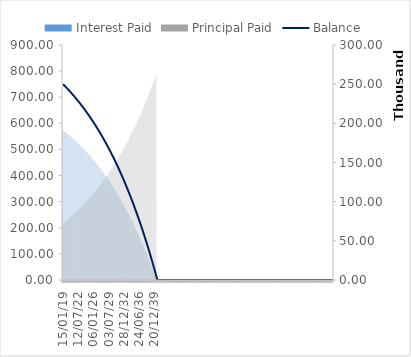
| Category | Interest Paid | Principal Paid |
|---|---|---|
| 15/01/19 | 576.148 | 214.712 |
| 29/01/19 | 575.654 | 215.207 |
| 12/02/19 | 575.158 | 215.703 |
| 26/02/19 | 574.661 | 216.2 |
| 12/03/19 | 574.162 | 216.698 |
| 26/03/19 | 573.663 | 217.197 |
| 09/04/19 | 573.162 | 217.698 |
| 23/04/19 | 572.661 | 218.2 |
| 07/05/19 | 572.158 | 218.702 |
| 21/05/19 | 571.654 | 219.206 |
| 04/06/19 | 571.149 | 219.712 |
| 18/06/19 | 570.642 | 220.218 |
| 02/07/19 | 570.135 | 220.725 |
| 16/07/19 | 569.626 | 221.234 |
| 30/07/19 | 569.116 | 221.744 |
| 13/08/19 | 568.605 | 222.255 |
| 27/08/19 | 568.093 | 222.767 |
| 10/09/19 | 567.58 | 223.281 |
| 24/09/19 | 567.065 | 223.795 |
| 08/10/19 | 566.549 | 224.311 |
| 22/10/19 | 566.032 | 224.828 |
| 05/11/19 | 565.514 | 225.346 |
| 19/11/19 | 564.995 | 225.865 |
| 03/12/19 | 564.474 | 226.386 |
| 17/12/19 | 563.953 | 226.908 |
| 31/12/19 | 563.43 | 227.431 |
| 14/01/20 | 562.905 | 227.955 |
| 28/01/20 | 562.38 | 228.48 |
| 11/02/20 | 561.854 | 229.007 |
| 25/02/20 | 561.326 | 229.534 |
| 10/03/20 | 560.797 | 230.063 |
| 24/03/20 | 560.267 | 230.594 |
| 07/04/20 | 559.735 | 231.125 |
| 21/04/20 | 559.203 | 231.658 |
| 05/05/20 | 558.669 | 232.192 |
| 19/05/20 | 558.134 | 232.727 |
| 02/06/20 | 557.597 | 233.263 |
| 16/06/20 | 557.06 | 233.801 |
| 30/06/20 | 556.521 | 234.339 |
| 14/07/20 | 555.981 | 234.879 |
| 28/07/20 | 555.439 | 235.421 |
| 11/08/20 | 554.897 | 235.963 |
| 25/08/20 | 554.353 | 236.507 |
| 08/09/20 | 553.808 | 237.052 |
| 22/09/20 | 553.262 | 237.598 |
| 06/10/20 | 552.714 | 238.146 |
| 20/10/20 | 552.165 | 238.695 |
| 03/11/20 | 551.615 | 239.245 |
| 17/11/20 | 551.064 | 239.796 |
| 01/12/20 | 550.511 | 240.349 |
| 15/12/20 | 549.957 | 240.903 |
| 29/12/20 | 549.402 | 241.458 |
| 12/01/21 | 548.846 | 242.014 |
| 26/01/21 | 548.288 | 242.572 |
| 09/02/21 | 547.729 | 243.131 |
| 23/02/21 | 547.169 | 243.692 |
| 09/03/21 | 546.607 | 244.253 |
| 23/03/21 | 546.044 | 244.816 |
| 06/04/21 | 545.48 | 245.38 |
| 20/04/21 | 544.914 | 245.946 |
| 04/05/21 | 544.348 | 246.513 |
| 18/05/21 | 543.78 | 247.081 |
| 01/06/21 | 543.21 | 247.65 |
| 15/06/21 | 542.639 | 248.221 |
| 29/06/21 | 542.067 | 248.793 |
| 13/07/21 | 541.494 | 249.366 |
| 27/07/21 | 540.919 | 249.941 |
| 10/08/21 | 540.343 | 250.517 |
| 24/08/21 | 539.766 | 251.094 |
| 07/09/21 | 539.187 | 251.673 |
| 21/09/21 | 538.607 | 252.253 |
| 05/10/21 | 538.026 | 252.834 |
| 19/10/21 | 537.443 | 253.417 |
| 02/11/21 | 536.859 | 254.001 |
| 16/11/21 | 536.274 | 254.586 |
| 30/11/21 | 535.687 | 255.173 |
| 14/12/21 | 535.099 | 255.761 |
| 28/12/21 | 534.51 | 256.351 |
| 11/01/22 | 533.919 | 256.941 |
| 25/01/22 | 533.327 | 257.534 |
| 08/02/22 | 532.733 | 258.127 |
| 22/02/22 | 532.138 | 258.722 |
| 08/03/22 | 531.542 | 259.318 |
| 22/03/22 | 530.944 | 259.916 |
| 05/04/22 | 530.345 | 260.515 |
| 19/04/22 | 529.745 | 261.115 |
| 03/05/22 | 529.143 | 261.717 |
| 17/05/22 | 528.54 | 262.32 |
| 31/05/22 | 527.936 | 262.925 |
| 14/06/22 | 527.33 | 263.531 |
| 28/06/22 | 526.722 | 264.138 |
| 12/07/22 | 526.114 | 264.747 |
| 26/07/22 | 525.503 | 265.357 |
| 09/08/22 | 524.892 | 265.968 |
| 23/08/22 | 524.279 | 266.581 |
| 06/09/22 | 523.665 | 267.196 |
| 20/09/22 | 523.049 | 267.811 |
| 04/10/22 | 522.432 | 268.429 |
| 18/10/22 | 521.813 | 269.047 |
| 01/11/22 | 521.193 | 269.667 |
| 15/11/22 | 520.571 | 270.289 |
| 29/11/22 | 519.949 | 270.912 |
| 13/12/22 | 519.324 | 271.536 |
| 27/12/22 | 518.698 | 272.162 |
| 10/01/23 | 518.071 | 272.789 |
| 24/01/23 | 517.443 | 273.418 |
| 07/02/23 | 516.812 | 274.048 |
| 21/02/23 | 516.181 | 274.679 |
| 07/03/23 | 515.548 | 275.312 |
| 21/03/23 | 514.913 | 275.947 |
| 04/04/23 | 514.277 | 276.583 |
| 18/04/23 | 513.64 | 277.22 |
| 02/05/23 | 513.001 | 277.859 |
| 16/05/23 | 512.361 | 278.499 |
| 30/05/23 | 511.719 | 279.141 |
| 13/06/23 | 511.076 | 279.785 |
| 27/06/23 | 510.431 | 280.429 |
| 11/07/23 | 509.785 | 281.076 |
| 25/07/23 | 509.137 | 281.723 |
| 08/08/23 | 508.488 | 282.373 |
| 22/08/23 | 507.837 | 283.023 |
| 05/09/23 | 507.185 | 283.676 |
| 19/09/23 | 506.531 | 284.329 |
| 03/10/23 | 505.876 | 284.985 |
| 17/10/23 | 505.219 | 285.641 |
| 31/10/23 | 504.56 | 286.3 |
| 14/11/23 | 503.901 | 286.96 |
| 28/11/23 | 503.239 | 287.621 |
| 12/12/23 | 502.576 | 288.284 |
| 26/12/23 | 501.912 | 288.948 |
| 09/01/24 | 501.246 | 289.614 |
| 23/01/24 | 500.579 | 290.281 |
| 06/02/24 | 499.91 | 290.95 |
| 20/02/24 | 499.239 | 291.621 |
| 05/03/24 | 498.567 | 292.293 |
| 19/03/24 | 497.894 | 292.967 |
| 02/04/24 | 497.218 | 293.642 |
| 16/04/24 | 496.542 | 294.319 |
| 30/04/24 | 495.863 | 294.997 |
| 14/05/24 | 495.184 | 295.677 |
| 28/05/24 | 494.502 | 296.358 |
| 11/06/24 | 493.819 | 297.041 |
| 25/06/24 | 493.135 | 297.726 |
| 09/07/24 | 492.448 | 298.412 |
| 23/07/24 | 491.761 | 299.099 |
| 06/08/24 | 491.071 | 299.789 |
| 20/08/24 | 490.381 | 300.48 |
| 03/09/24 | 489.688 | 301.172 |
| 17/09/24 | 488.994 | 301.866 |
| 01/10/24 | 488.298 | 302.562 |
| 15/10/24 | 487.601 | 303.259 |
| 29/10/24 | 486.902 | 303.958 |
| 12/11/24 | 486.202 | 304.659 |
| 26/11/24 | 485.5 | 305.361 |
| 10/12/24 | 484.796 | 306.064 |
| 24/12/24 | 484.09 | 306.77 |
| 07/01/25 | 483.383 | 307.477 |
| 21/01/25 | 482.675 | 308.185 |
| 04/02/25 | 481.965 | 308.896 |
| 18/02/25 | 481.253 | 309.607 |
| 04/03/25 | 480.539 | 310.321 |
| 18/03/25 | 479.824 | 311.036 |
| 01/04/25 | 479.107 | 311.753 |
| 15/04/25 | 478.389 | 312.471 |
| 29/04/25 | 477.669 | 313.192 |
| 13/05/25 | 476.947 | 313.913 |
| 27/05/25 | 476.223 | 314.637 |
| 10/06/25 | 475.498 | 315.362 |
| 24/06/25 | 474.772 | 316.089 |
| 08/07/25 | 474.043 | 316.817 |
| 22/07/25 | 473.313 | 317.547 |
| 05/08/25 | 472.581 | 318.279 |
| 19/08/25 | 471.848 | 319.013 |
| 02/09/25 | 471.112 | 319.748 |
| 16/09/25 | 470.376 | 320.485 |
| 30/09/25 | 469.637 | 321.223 |
| 14/10/25 | 468.897 | 321.964 |
| 28/10/25 | 468.155 | 322.706 |
| 11/11/25 | 467.411 | 323.449 |
| 25/11/25 | 466.666 | 324.195 |
| 09/12/25 | 465.918 | 324.942 |
| 23/12/25 | 465.17 | 325.691 |
| 06/01/26 | 464.419 | 326.441 |
| 20/01/26 | 463.667 | 327.194 |
| 03/02/26 | 462.913 | 327.948 |
| 17/02/26 | 462.157 | 328.703 |
| 03/03/26 | 461.399 | 329.461 |
| 17/03/26 | 460.64 | 330.22 |
| 31/03/26 | 459.879 | 330.981 |
| 14/04/26 | 459.116 | 331.744 |
| 28/04/26 | 458.352 | 332.509 |
| 12/05/26 | 457.585 | 333.275 |
| 26/05/26 | 456.817 | 334.043 |
| 09/06/26 | 456.047 | 334.813 |
| 23/06/26 | 455.276 | 335.584 |
| 07/07/26 | 454.502 | 336.358 |
| 21/07/26 | 453.727 | 337.133 |
| 04/08/26 | 452.95 | 337.91 |
| 18/08/26 | 452.172 | 338.689 |
| 01/09/26 | 451.391 | 339.469 |
| 15/09/26 | 450.609 | 340.251 |
| 29/09/26 | 449.825 | 341.036 |
| 13/10/26 | 449.039 | 341.822 |
| 27/10/26 | 448.251 | 342.609 |
| 10/11/26 | 447.461 | 343.399 |
| 24/11/26 | 446.67 | 344.19 |
| 08/12/26 | 445.877 | 344.983 |
| 22/12/26 | 445.082 | 345.779 |
| 05/01/27 | 444.285 | 346.575 |
| 19/01/27 | 443.486 | 347.374 |
| 02/02/27 | 442.686 | 348.175 |
| 16/02/27 | 441.883 | 348.977 |
| 02/03/27 | 441.079 | 349.781 |
| 16/03/27 | 440.273 | 350.587 |
| 30/03/27 | 439.465 | 351.395 |
| 13/04/27 | 438.655 | 352.205 |
| 27/04/27 | 437.843 | 353.017 |
| 11/05/27 | 437.03 | 353.83 |
| 25/05/27 | 436.214 | 354.646 |
| 08/06/27 | 435.397 | 355.463 |
| 22/06/27 | 434.578 | 356.282 |
| 06/07/27 | 433.757 | 357.104 |
| 20/07/27 | 432.934 | 357.926 |
| 03/08/27 | 432.109 | 358.751 |
| 17/08/27 | 431.282 | 359.578 |
| 31/08/27 | 430.453 | 360.407 |
| 14/09/27 | 429.623 | 361.237 |
| 28/09/27 | 428.79 | 362.07 |
| 12/10/27 | 427.956 | 362.904 |
| 26/10/27 | 427.119 | 363.741 |
| 09/11/27 | 426.281 | 364.579 |
| 23/11/27 | 425.441 | 365.419 |
| 07/12/27 | 424.599 | 366.261 |
| 21/12/27 | 423.755 | 367.105 |
| 04/01/28 | 422.909 | 367.951 |
| 18/01/28 | 422.061 | 368.799 |
| 01/02/28 | 421.211 | 369.649 |
| 15/02/28 | 420.359 | 370.501 |
| 29/02/28 | 419.505 | 371.355 |
| 14/03/28 | 418.649 | 372.211 |
| 28/03/28 | 417.791 | 373.069 |
| 11/04/28 | 416.932 | 373.928 |
| 25/04/28 | 416.07 | 374.79 |
| 09/05/28 | 415.206 | 375.654 |
| 23/05/28 | 414.34 | 376.52 |
| 06/06/28 | 413.473 | 377.387 |
| 20/06/28 | 412.603 | 378.257 |
| 04/07/28 | 411.731 | 379.129 |
| 18/07/28 | 410.858 | 380.003 |
| 01/08/28 | 409.982 | 380.878 |
| 15/08/28 | 409.104 | 381.756 |
| 29/08/28 | 408.224 | 382.636 |
| 12/09/28 | 407.342 | 383.518 |
| 26/09/28 | 406.459 | 384.402 |
| 10/10/28 | 405.573 | 385.287 |
| 24/10/28 | 404.685 | 386.175 |
| 07/11/28 | 403.795 | 387.065 |
| 21/11/28 | 402.903 | 387.957 |
| 05/12/28 | 402.009 | 388.852 |
| 19/12/28 | 401.113 | 389.748 |
| 02/01/29 | 400.214 | 390.646 |
| 16/01/29 | 399.314 | 391.546 |
| 30/01/29 | 398.412 | 392.449 |
| 13/02/29 | 397.507 | 393.353 |
| 27/02/29 | 396.601 | 394.259 |
| 13/03/29 | 395.692 | 395.168 |
| 27/03/29 | 394.781 | 396.079 |
| 10/04/29 | 393.869 | 396.992 |
| 24/04/29 | 392.954 | 397.906 |
| 08/05/29 | 392.037 | 398.823 |
| 22/05/29 | 391.118 | 399.743 |
| 05/06/29 | 390.196 | 400.664 |
| 19/06/29 | 389.273 | 401.587 |
| 03/07/29 | 388.347 | 402.513 |
| 17/07/29 | 387.42 | 403.44 |
| 31/07/29 | 386.49 | 404.37 |
| 14/08/29 | 385.558 | 405.302 |
| 28/08/29 | 384.624 | 406.236 |
| 11/09/29 | 383.688 | 407.172 |
| 25/09/29 | 382.75 | 408.111 |
| 09/10/29 | 381.809 | 409.051 |
| 23/10/29 | 380.866 | 409.994 |
| 06/11/29 | 379.921 | 410.939 |
| 20/11/29 | 378.974 | 411.886 |
| 04/12/29 | 378.025 | 412.835 |
| 18/12/29 | 377.074 | 413.786 |
| 01/01/30 | 376.12 | 414.74 |
| 15/01/30 | 375.164 | 415.696 |
| 29/01/30 | 374.206 | 416.654 |
| 12/02/30 | 373.246 | 417.614 |
| 26/02/30 | 372.284 | 418.577 |
| 12/03/30 | 371.319 | 419.541 |
| 26/03/30 | 370.352 | 420.508 |
| 09/04/30 | 369.383 | 421.477 |
| 23/04/30 | 368.412 | 422.448 |
| 07/05/30 | 367.438 | 423.422 |
| 21/05/30 | 366.462 | 424.398 |
| 04/06/30 | 365.484 | 425.376 |
| 18/06/30 | 364.504 | 426.356 |
| 02/07/30 | 363.521 | 427.339 |
| 16/07/30 | 362.537 | 428.324 |
| 30/07/30 | 361.549 | 429.311 |
| 13/08/30 | 360.56 | 430.3 |
| 27/08/30 | 359.568 | 431.292 |
| 10/09/30 | 358.574 | 432.286 |
| 24/09/30 | 357.578 | 433.282 |
| 08/10/30 | 356.58 | 434.281 |
| 22/10/30 | 355.579 | 435.281 |
| 05/11/30 | 354.576 | 436.285 |
| 19/11/30 | 353.57 | 437.29 |
| 03/12/30 | 352.562 | 438.298 |
| 17/12/30 | 351.552 | 439.308 |
| 31/12/30 | 350.54 | 440.32 |
| 14/01/31 | 349.525 | 441.335 |
| 28/01/31 | 348.508 | 442.352 |
| 11/02/31 | 347.489 | 443.372 |
| 25/02/31 | 346.467 | 444.393 |
| 11/03/31 | 345.443 | 445.418 |
| 25/03/31 | 344.416 | 446.444 |
| 08/04/31 | 343.387 | 447.473 |
| 22/04/31 | 342.356 | 448.504 |
| 06/05/31 | 341.322 | 449.538 |
| 20/05/31 | 340.286 | 450.574 |
| 03/06/31 | 339.248 | 451.612 |
| 17/06/31 | 338.207 | 452.653 |
| 01/07/31 | 337.164 | 453.696 |
| 15/07/31 | 336.118 | 454.742 |
| 29/07/31 | 335.07 | 455.79 |
| 12/08/31 | 334.02 | 456.84 |
| 26/08/31 | 332.967 | 457.893 |
| 09/09/31 | 331.912 | 458.948 |
| 23/09/31 | 330.854 | 460.006 |
| 07/10/31 | 329.794 | 461.066 |
| 21/10/31 | 328.732 | 462.129 |
| 04/11/31 | 327.667 | 463.194 |
| 18/11/31 | 326.599 | 464.261 |
| 02/12/31 | 325.529 | 465.331 |
| 16/12/31 | 324.457 | 466.403 |
| 30/12/31 | 323.382 | 467.478 |
| 13/01/32 | 322.305 | 468.556 |
| 27/01/32 | 321.225 | 469.635 |
| 10/02/32 | 320.142 | 470.718 |
| 24/02/32 | 319.058 | 471.803 |
| 09/03/32 | 317.97 | 472.89 |
| 23/03/32 | 316.88 | 473.98 |
| 06/04/32 | 315.788 | 475.072 |
| 20/04/32 | 314.693 | 476.167 |
| 04/05/32 | 313.596 | 477.264 |
| 18/05/32 | 312.496 | 478.364 |
| 01/06/32 | 311.394 | 479.467 |
| 15/06/32 | 310.289 | 480.572 |
| 29/06/32 | 309.181 | 481.679 |
| 13/07/32 | 308.071 | 482.789 |
| 27/07/32 | 306.958 | 483.902 |
| 10/08/32 | 305.843 | 485.017 |
| 24/08/32 | 304.725 | 486.135 |
| 07/09/32 | 303.605 | 487.255 |
| 21/09/32 | 302.482 | 488.378 |
| 05/10/32 | 301.357 | 489.504 |
| 19/10/32 | 300.228 | 490.632 |
| 02/11/32 | 299.098 | 491.762 |
| 16/11/32 | 297.964 | 492.896 |
| 30/11/32 | 296.829 | 494.032 |
| 14/12/32 | 295.69 | 495.17 |
| 28/12/32 | 294.549 | 496.311 |
| 11/01/33 | 293.405 | 497.455 |
| 25/01/33 | 292.259 | 498.602 |
| 08/02/33 | 291.11 | 499.751 |
| 22/02/33 | 289.958 | 500.902 |
| 08/03/33 | 288.803 | 502.057 |
| 22/03/33 | 287.646 | 503.214 |
| 05/04/33 | 286.487 | 504.373 |
| 19/04/33 | 285.324 | 505.536 |
| 03/05/33 | 284.159 | 506.701 |
| 17/05/33 | 282.992 | 507.869 |
| 31/05/33 | 281.821 | 509.039 |
| 14/06/33 | 280.648 | 510.212 |
| 28/06/33 | 279.472 | 511.388 |
| 12/07/33 | 278.294 | 512.567 |
| 26/07/33 | 277.112 | 513.748 |
| 09/08/33 | 275.928 | 514.932 |
| 23/08/33 | 274.742 | 516.119 |
| 06/09/33 | 273.552 | 517.308 |
| 20/09/33 | 272.36 | 518.5 |
| 04/10/33 | 271.165 | 519.695 |
| 18/10/33 | 269.967 | 520.893 |
| 01/11/33 | 268.767 | 522.093 |
| 15/11/33 | 267.564 | 523.296 |
| 29/11/33 | 266.358 | 524.502 |
| 13/12/33 | 265.149 | 525.711 |
| 27/12/33 | 263.937 | 526.923 |
| 10/01/34 | 262.723 | 528.137 |
| 24/01/34 | 261.506 | 529.354 |
| 07/02/34 | 260.286 | 530.574 |
| 21/02/34 | 259.063 | 531.797 |
| 07/03/34 | 257.838 | 533.023 |
| 21/03/34 | 256.609 | 534.251 |
| 04/04/34 | 255.378 | 535.482 |
| 18/04/34 | 254.144 | 536.716 |
| 02/05/34 | 252.907 | 537.953 |
| 16/05/34 | 251.667 | 539.193 |
| 30/05/34 | 250.425 | 540.436 |
| 13/06/34 | 249.179 | 541.681 |
| 27/06/34 | 247.931 | 542.929 |
| 11/07/34 | 246.68 | 544.181 |
| 25/07/34 | 245.426 | 545.435 |
| 08/08/34 | 244.168 | 546.692 |
| 22/08/34 | 242.909 | 547.952 |
| 05/09/34 | 241.646 | 549.214 |
| 19/09/34 | 240.38 | 550.48 |
| 03/10/34 | 239.111 | 551.749 |
| 17/10/34 | 237.84 | 553.02 |
| 31/10/34 | 236.565 | 554.295 |
| 14/11/34 | 235.288 | 555.572 |
| 28/11/34 | 234.008 | 556.853 |
| 12/12/34 | 232.724 | 558.136 |
| 26/12/34 | 231.438 | 559.422 |
| 09/01/35 | 230.149 | 560.711 |
| 23/01/35 | 228.857 | 562.004 |
| 06/02/35 | 227.561 | 563.299 |
| 20/02/35 | 226.263 | 564.597 |
| 06/03/35 | 224.962 | 565.898 |
| 20/03/35 | 223.658 | 567.202 |
| 03/04/35 | 222.351 | 568.51 |
| 17/04/35 | 221.041 | 569.82 |
| 01/05/35 | 219.727 | 571.133 |
| 15/05/35 | 218.411 | 572.449 |
| 29/05/35 | 217.092 | 573.768 |
| 12/06/35 | 215.77 | 575.091 |
| 26/06/35 | 214.444 | 576.416 |
| 10/07/35 | 213.116 | 577.744 |
| 24/07/35 | 211.784 | 579.076 |
| 07/08/35 | 210.45 | 580.41 |
| 21/08/35 | 209.112 | 581.748 |
| 04/09/35 | 207.771 | 583.089 |
| 18/09/35 | 206.428 | 584.433 |
| 02/10/35 | 205.081 | 585.779 |
| 16/10/35 | 203.731 | 587.129 |
| 30/10/35 | 202.378 | 588.482 |
| 13/11/35 | 201.021 | 589.839 |
| 27/11/35 | 199.662 | 591.198 |
| 11/12/35 | 198.3 | 592.561 |
| 25/12/35 | 196.934 | 593.926 |
| 08/01/36 | 195.565 | 595.295 |
| 22/01/36 | 194.193 | 596.667 |
| 05/02/36 | 192.818 | 598.042 |
| 19/02/36 | 191.44 | 599.42 |
| 04/03/36 | 190.059 | 600.802 |
| 18/03/36 | 188.674 | 602.186 |
| 01/04/36 | 187.286 | 603.574 |
| 15/04/36 | 185.895 | 604.965 |
| 29/04/36 | 184.501 | 606.359 |
| 13/05/36 | 183.104 | 607.757 |
| 27/05/36 | 181.703 | 609.157 |
| 10/06/36 | 180.299 | 610.561 |
| 24/06/36 | 178.892 | 611.968 |
| 08/07/36 | 177.482 | 613.378 |
| 22/07/36 | 176.068 | 614.792 |
| 05/08/36 | 174.651 | 616.209 |
| 19/08/36 | 173.231 | 617.629 |
| 02/09/36 | 171.808 | 619.052 |
| 16/09/36 | 170.381 | 620.479 |
| 30/09/36 | 168.951 | 621.909 |
| 14/10/36 | 167.518 | 623.342 |
| 28/10/36 | 166.081 | 624.779 |
| 11/11/36 | 164.642 | 626.219 |
| 25/11/36 | 163.198 | 627.662 |
| 09/12/36 | 161.752 | 629.108 |
| 23/12/36 | 160.302 | 630.558 |
| 06/01/37 | 158.849 | 632.011 |
| 20/01/37 | 157.392 | 633.468 |
| 03/02/37 | 155.932 | 634.928 |
| 17/02/37 | 154.469 | 636.391 |
| 03/03/37 | 153.003 | 637.858 |
| 17/03/37 | 151.533 | 639.328 |
| 31/03/37 | 150.059 | 640.801 |
| 14/04/37 | 148.582 | 642.278 |
| 28/04/37 | 147.102 | 643.758 |
| 12/05/37 | 145.619 | 645.242 |
| 26/05/37 | 144.132 | 646.729 |
| 09/06/37 | 142.641 | 648.219 |
| 23/06/37 | 141.147 | 649.713 |
| 07/07/37 | 139.65 | 651.21 |
| 21/07/37 | 138.149 | 652.711 |
| 04/08/37 | 136.645 | 654.215 |
| 18/08/37 | 135.137 | 655.723 |
| 01/09/37 | 133.626 | 657.234 |
| 15/09/37 | 132.111 | 658.749 |
| 29/09/37 | 130.593 | 660.267 |
| 13/10/37 | 129.072 | 661.789 |
| 27/10/37 | 127.546 | 663.314 |
| 10/11/37 | 126.018 | 664.842 |
| 24/11/37 | 124.486 | 666.375 |
| 08/12/37 | 122.95 | 667.91 |
| 22/12/37 | 121.411 | 669.45 |
| 05/01/38 | 119.868 | 670.992 |
| 19/01/38 | 118.321 | 672.539 |
| 02/02/38 | 116.771 | 674.089 |
| 16/02/38 | 115.218 | 675.642 |
| 02/03/38 | 113.661 | 677.199 |
| 16/03/38 | 112.1 | 678.76 |
| 30/03/38 | 110.536 | 680.324 |
| 13/04/38 | 108.968 | 681.892 |
| 27/04/38 | 107.397 | 683.464 |
| 11/05/38 | 105.821 | 685.039 |
| 25/05/38 | 104.243 | 686.617 |
| 08/06/38 | 102.66 | 688.2 |
| 22/06/38 | 101.074 | 689.786 |
| 06/07/38 | 99.485 | 691.376 |
| 20/07/38 | 97.891 | 692.969 |
| 03/08/38 | 96.294 | 694.566 |
| 17/08/38 | 94.694 | 696.167 |
| 31/08/38 | 93.089 | 697.771 |
| 14/09/38 | 91.481 | 699.379 |
| 28/09/38 | 89.869 | 700.991 |
| 12/10/38 | 88.254 | 702.606 |
| 26/10/38 | 86.635 | 704.226 |
| 09/11/38 | 85.012 | 705.848 |
| 23/11/38 | 83.385 | 707.475 |
| 07/12/38 | 81.755 | 709.106 |
| 21/12/38 | 80.12 | 710.74 |
| 04/01/39 | 78.482 | 712.378 |
| 18/01/39 | 76.841 | 714.02 |
| 01/02/39 | 75.195 | 715.665 |
| 15/02/39 | 73.546 | 717.314 |
| 01/03/39 | 71.893 | 718.967 |
| 15/03/39 | 70.236 | 720.624 |
| 29/03/39 | 68.575 | 722.285 |
| 12/04/39 | 66.91 | 723.95 |
| 26/04/39 | 65.242 | 725.618 |
| 10/05/39 | 63.57 | 727.29 |
| 24/05/39 | 61.894 | 728.967 |
| 07/06/39 | 60.214 | 730.646 |
| 21/06/39 | 58.53 | 732.33 |
| 05/07/39 | 56.842 | 734.018 |
| 19/07/39 | 55.151 | 735.71 |
| 02/08/39 | 53.455 | 737.405 |
| 16/08/39 | 51.756 | 739.105 |
| 30/08/39 | 50.052 | 740.808 |
| 13/09/39 | 48.345 | 742.515 |
| 27/09/39 | 46.634 | 744.226 |
| 11/10/39 | 44.919 | 745.942 |
| 25/10/39 | 43.2 | 747.661 |
| 08/11/39 | 41.477 | 749.384 |
| 22/11/39 | 39.749 | 751.111 |
| 06/12/39 | 38.018 | 752.842 |
| 20/12/39 | 36.283 | 754.577 |
| 03/01/40 | 34.544 | 756.316 |
| 17/01/40 | 32.801 | 758.059 |
| 31/01/40 | 31.054 | 759.806 |
| 14/02/40 | 29.303 | 761.557 |
| 28/02/40 | 27.548 | 763.312 |
| 13/03/40 | 25.789 | 765.071 |
| 27/03/40 | 24.026 | 766.834 |
| 10/04/40 | 22.259 | 768.601 |
| 24/04/40 | 20.488 | 770.373 |
| 08/05/40 | 18.712 | 772.148 |
| 22/05/40 | 16.933 | 773.928 |
| 05/06/40 | 15.149 | 775.711 |
| 19/06/40 | 13.361 | 777.499 |
| 03/07/40 | 11.57 | 779.291 |
| 17/07/40 | 9.774 | 781.087 |
| 31/07/40 | 7.973 | 782.887 |
| 14/08/40 | 6.169 | 784.691 |
| 28/08/40 | 4.361 | 786.499 |
| 11/09/40 | 2.548 | 788.312 |
| 25/09/40 | 0.732 | 317.43 |